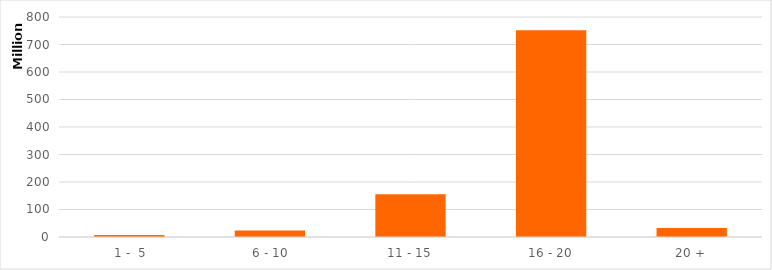
| Category | Series 0 |
|---|---|
|  1 -  5 | 7083668.92 |
|  6 - 10 | 23846268.42 |
| 11 - 15 | 155630830.1 |
| 16 - 20 | 752174662.63 |
| 20 + | 32319560.68 |